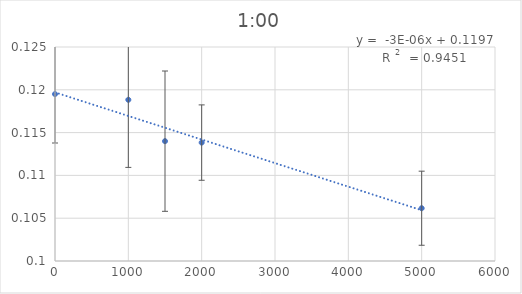
| Category | Series 0 |
|---|---|
| 5000.0 | 0.106 |
| 2000.0 | 0.114 |
| 1500.0 | 0.114 |
| 1000.0 | 0.119 |
| 0.0 | 0.12 |